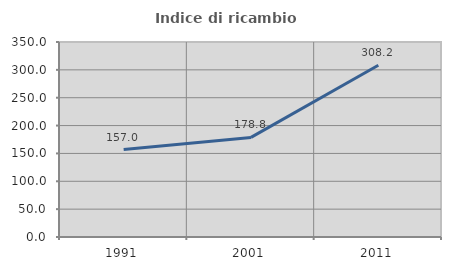
| Category | Indice di ricambio occupazionale  |
|---|---|
| 1991.0 | 156.989 |
| 2001.0 | 178.75 |
| 2011.0 | 308.197 |